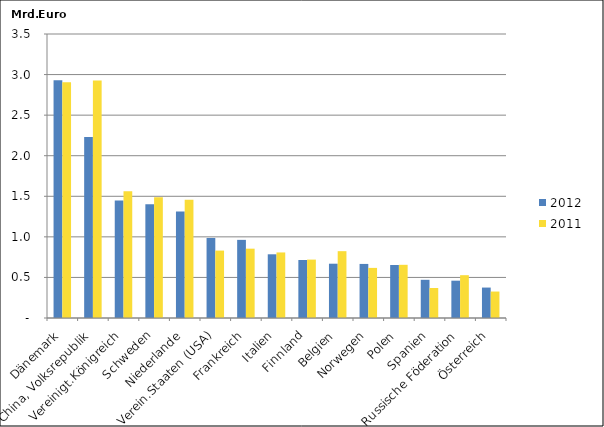
| Category | 2012 | 2011 |
|---|---|---|
| Dänemark | 2.932 | 2.905 |
| China, Volksrepublik | 2.23 | 2.927 |
| Vereinigt.Königreich | 1.449 | 1.563 |
| Schweden | 1.402 | 1.488 |
| Niederlande | 1.312 | 1.456 |
| Verein.Staaten (USA) | 0.986 | 0.831 |
| Frankreich | 0.963 | 0.854 |
| Italien | 0.785 | 0.808 |
| Finnland | 0.715 | 0.72 |
| Belgien | 0.669 | 0.824 |
| Norwegen | 0.666 | 0.617 |
| Polen | 0.654 | 0.656 |
| Spanien | 0.471 | 0.37 |
| Russische Föderation | 0.46 | 0.528 |
| Österreich | 0.375 | 0.326 |